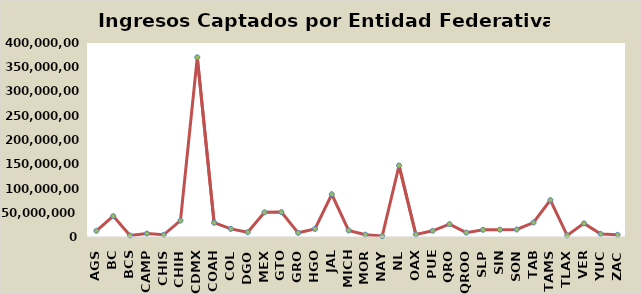
| Category | Series 0 |
|---|---|
| AGS | 12848649 |
| BC | 43063729 |
| BCS | 3110769 |
| CAMP | 7071542 |
| CHIS | 4583607 |
| CHIH | 33831797 |
| CDMX | 370502631.91 |
| COAH | 29406028 |
| COL | 16680004 |
| DGO | 9792275 |
| MEX | 50874269 |
| GTO | 51297956 |
| GRO | 8602532 |
| HGO | 16614616 |
| JAL | 88057818 |
| MICH | 13462377 |
| MOR | 4794101 |
| NAY | 1939181 |
| NL | 147323417 |
| OAX | 5190343 |
| PUE | 12844670 |
| QRO | 26549421 |
| QROO | 9051095 |
| SLP | 14828747 |
| SIN | 15181773 |
| SON | 15458720 |
| TAB | 29848014 |
| TAMS | 75967759 |
| TLAX | 3373981 |
| VER | 28061026 |
| YUC | 6222004 |
| ZAC | 4397881 |